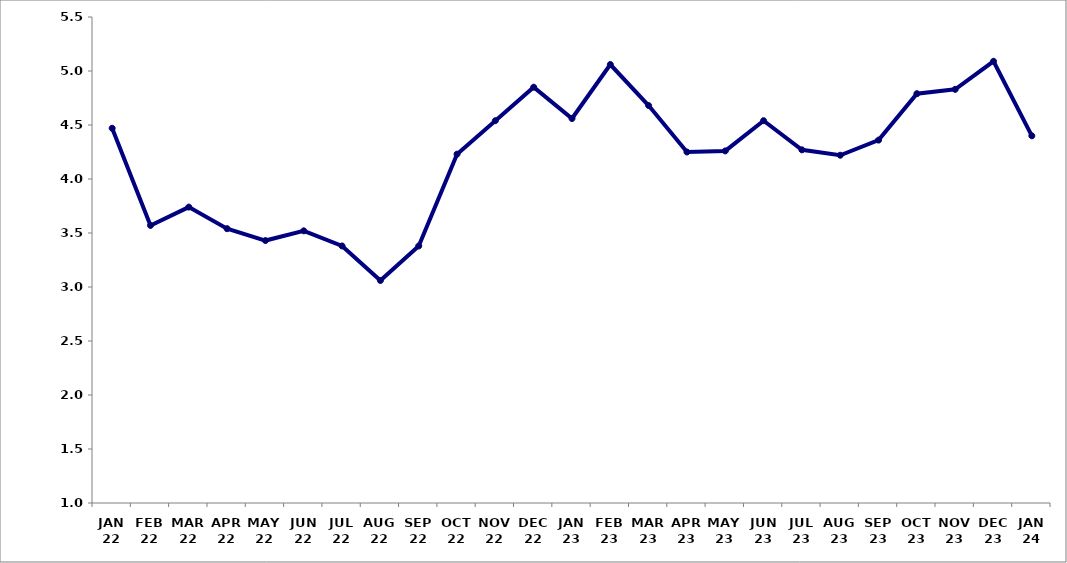
| Category | Series 0 |
|---|---|
| JAN 22 | 4.47 |
| FEB 22 | 3.57 |
| MAR 22 | 3.74 |
| APR 22 | 3.54 |
| MAY 22 | 3.43 |
| JUN 22 | 3.52 |
| JUL 22 | 3.38 |
| AUG 22 | 3.06 |
| SEP 22 | 3.38 |
| OCT 22 | 4.23 |
| NOV 22 | 4.54 |
| DEC 22 | 4.85 |
| JAN 23 | 4.56 |
| FEB 23 | 5.06 |
| MAR 23 | 4.68 |
| APR 23 | 4.25 |
| MAY 23 | 4.26 |
| JUN 23 | 4.54 |
| JUL 23 | 4.27 |
| AUG 23 | 4.22 |
| SEP 23 | 4.36 |
| OCT 23 | 4.79 |
| NOV 23 | 4.83 |
| DEC 23 | 5.09 |
| JAN 24 | 4.4 |